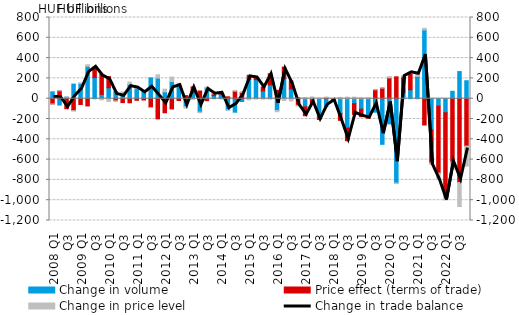
| Category | Change in volume | Price effect (terms of trade) | Change in price level |
|---|---|---|---|
| 2008 Q1 | 67.878 | -52.167 | -0.023 |
| Q2 | -62.953 | 77.725 | 0.798 |
| Q3 | 15.817 | -98.587 | 0.331 |
| Q4 | 143.921 | -117.873 | -1.175 |
| 2009 Q1 | 150.002 | -56.839 | 6.647 |
| Q2 | 319.051 | -71.308 | 15.484 |
| Q3 | 208.671 | 100.9 | 4.589 |
| Q4 | 42.885 | 196.379 | -11.821 |
| 2010 Q1 | 107.908 | 110.525 | -26.775 |
| Q2 | 70.232 | -21.135 | -1.384 |
| Q3 | 40.66 | -38.664 | 25.916 |
| Q4 | 141.44 | -40.278 | 22.417 |
| 2011 Q1 | 99.616 | -15.621 | 24.904 |
| Q2 | 72.003 | -12.847 | 4.004 |
| Q3 | 205.478 | -86.528 | -0.675 |
| Q4 | 202.971 | -198.68 | 32.933 |
| 2012 Q1 | 67.827 | -138.712 | 26.28 |
| Q2 | 168.881 | -101.016 | 44.019 |
| Q3 | 131.703 | -17.93 | 19.891 |
| Q4 | -78.193 | 30.638 | -14.671 |
| 2013 Q1 | 62.503 | 54.253 | -5.801 |
| Q2 | -132.078 | 75.942 | -6.661 |
| Q3 | 107.946 | -19.534 | 7.612 |
| Q4 | 30.131 | 17.372 | 2.031 |
| 2014 Q1 | 44.677 | 12.942 | 0.946 |
| Q2 | -110.751 | 18.46 | -0.118 |
| Q3 | -133.081 | 74.482 | 7.038 |
| Q4 | -27.459 | 62.498 | 4.762 |
| 2015 Q1 | 190.509 | 39.821 | -10.893 |
| Q2 | 188.019 | 22.007 | -1.031 |
| Q3 | 76.745 | 38.773 | -3.333 |
| Q4 | 136.156 | 109.886 | -2.829 |
| 2016 Q1 | -115.775 | 82.671 | -12.541 |
| Q2 | 200.984 | 110.443 | -18.061 |
| Q3 | 96.507 | 78.067 | -22.332 |
| Q4 | 12.006 | -65.413 | -6.856 |
| 2017 Q1 | -80.212 | -87.529 | 11.097 |
| Q2 | -6.938 | -39.941 | 17.3 |
| Q3 | -183.155 | -21.882 | 3.852 |
| Q4 | -75.893 | 9.064 | 7.173 |
| 2018 Q1 | -0.246 | -13.897 | 0.326 |
| Q2 | -145.56 | -67.835 | 12.724 |
| Q3 | -289.869 | -124.452 | 15.721 |
| Q4 | -49.36 | -105.222 | 15.354 |
| 2019 Q1 | -103.165 | -74.034 | 8.791 |
| Q2 | -178.358 | -14.29 | 7.398 |
| Q3 | -133.186 | 87.449 | 0.54 |
| Q4 | -449.746 | 104.719 | 0.281 |
| 2020 Q1 | -248.144 | 205.584 | 11.904 |
| Q2 | -830.703 | 215.329 | -4.639 |
| Q3 | 64.138 | 148.689 | 11.571 |
| Q4 | 87.989 | 160.539 | 11.12 |
| 2021 Q1 | 214.908 | 2.603 | 27.959 |
| Q2 | 677.787 | -259.287 | 16.083 |
| Q3 | -308.119 | -324.436 | -14.912 |
| Q4 | -73.586 | -659.546 | -63.695 |
| 2022 Q1 | -138.599 | -797.419 | -61.533 |
| Q2 | 72.982 | -623.252 | -66.308 |
| Q3 | 267.162 | -826.415 | -235.744 |
| Q4 | 177.208 | -467.176 | -196.926 |